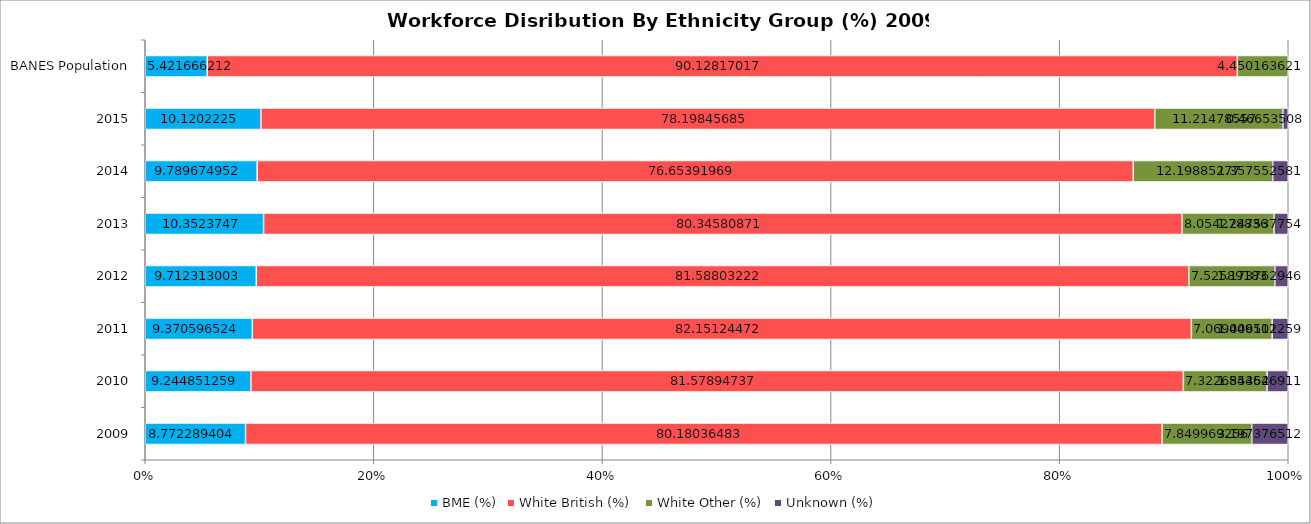
| Category | BME (%) | White British (%)  | White Other (%) | Unknown (%) |
|---|---|---|---|---|
| 2009 | 8.772 | 80.18 | 7.85 | 3.197 |
| 2010 | 9.245 | 81.579 | 7.323 | 1.854 |
| 2011 | 9.371 | 82.151 | 7.069 | 1.409 |
| 2012 | 9.712 | 81.588 | 7.526 | 1.174 |
| 2013 | 10.352 | 80.346 | 8.054 | 1.248 |
| 2014 | 9.79 | 76.654 | 12.199 | 1.358 |
| 2015 | 10.12 | 78.198 | 11.215 | 0.467 |
| BANES Population | 5.422 | 90.128 | 4.45 | 0 |